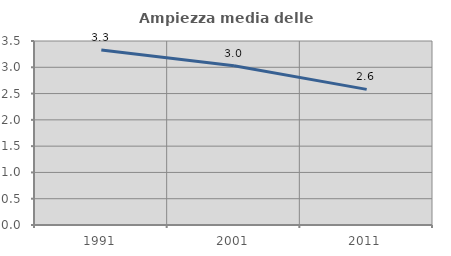
| Category | Ampiezza media delle famiglie |
|---|---|
| 1991.0 | 3.33 |
| 2001.0 | 3.03 |
| 2011.0 | 2.58 |